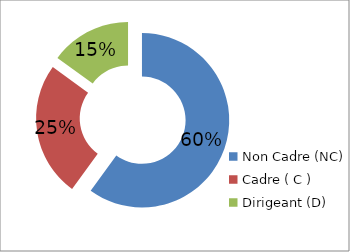
| Category | Series 0 |
|---|---|
| Non Cadre (NC) | 0.6 |
| Cadre ( C ) | 0.25 |
| Dirigeant (D) | 0.15 |